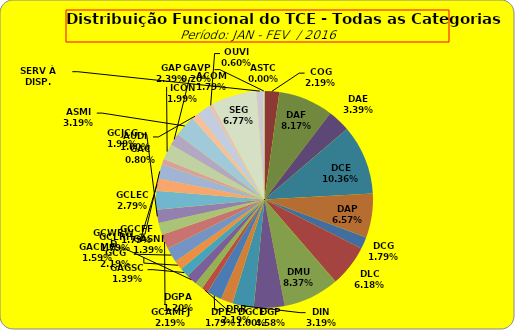
| Category | ASTC |
|---|---|
| ASTC | 0 |
| COG | 11 |
| DAF | 41 |
| DAE | 17 |
| DCE | 52 |
| DAP | 33 |
| DCG | 9 |
| DLC | 31 |
| DMU | 42 |
| DGP | 23 |
| DIN | 16 |
| DPE | 9 |
| DRR | 11 |
| DGCE | 5 |
| DGPA | 6 |
| GACMG | 8 |
| GAGSC | 7 |
| GASNI | 7 |
| GCG | 11 |
| GCAMFJ | 11 |
| GCCFF | 9 |
| GCJCG | 10 |
| GCLEC | 14 |
| GCLRH | 9 |
| GCWRWD | 11 |
| GAC | 4 |
| GAP | 12 |
| ACOM | 9 |
| ASMI | 16 |
| AUDI | 5 |
| ICON | 10 |
| OUVI | 3 |
| SEG | 34 |
| SERV À DISP. | 5 |
| GAVP | 1 |